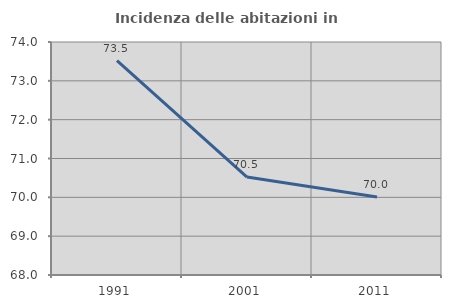
| Category | Incidenza delle abitazioni in proprietà  |
|---|---|
| 1991.0 | 73.521 |
| 2001.0 | 70.522 |
| 2011.0 | 70.006 |